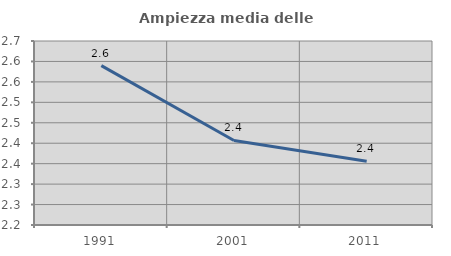
| Category | Ampiezza media delle famiglie |
|---|---|
| 1991.0 | 2.59 |
| 2001.0 | 2.407 |
| 2011.0 | 2.356 |